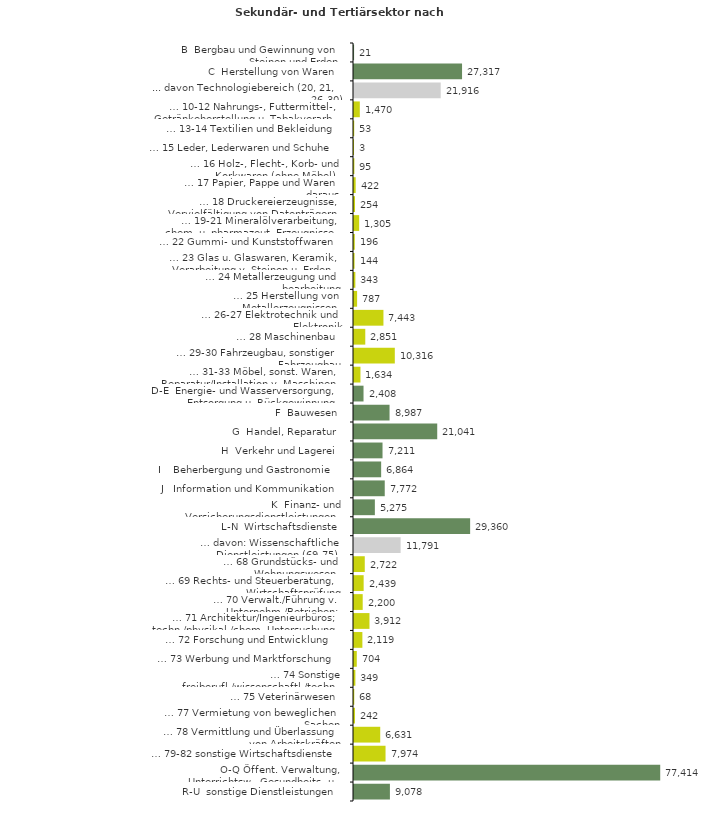
| Category | Series 0 |
|---|---|
| B  Bergbau und Gewinnung von Steinen und Erden | 21 |
| C  Herstellung von Waren | 27317 |
| ... davon Technologiebereich (20, 21, 26-30) | 21916 |
| … 10-12 Nahrungs-, Futtermittel-, Getränkeherstellung u. Tabakverarb. | 1470 |
| … 13-14 Textilien und Bekleidung | 53 |
| … 15 Leder, Lederwaren und Schuhe | 3 |
| … 16 Holz-, Flecht-, Korb- und Korkwaren (ohne Möbel)  | 95 |
| … 17 Papier, Pappe und Waren daraus  | 422 |
| … 18 Druckereierzeugnisse, Vervielfältigung von Datenträgern | 254 |
| … 19-21 Mineralölverarbeitung, chem. u. pharmazeut. Erzeugnisse | 1305 |
| … 22 Gummi- und Kunststoffwaren | 196 |
| … 23 Glas u. Glaswaren, Keramik, Verarbeitung v. Steinen u. Erden  | 144 |
| … 24 Metallerzeugung und -bearbeitung | 343 |
| … 25 Herstellung von Metallerzeugnissen  | 787 |
| … 26-27 Elektrotechnik und Elektronik | 7443 |
| … 28 Maschinenbau | 2851 |
| … 29-30 Fahrzeugbau, sonstiger Fahrzeugbau | 10316 |
| … 31-33 Möbel, sonst. Waren, Reparatur/Installation v. Maschinen | 1634 |
| D-E  Energie- und Wasserversorgung, Entsorgung u. Rückgewinnung | 2408 |
| F  Bauwesen | 8987 |
| G  Handel, Reparatur | 21041 |
| H  Verkehr und Lagerei | 7211 |
| I    Beherbergung und Gastronomie | 6864 |
| J   Information und Kommunikation | 7772 |
| K  Finanz- und Versicherungsdienstleistungen | 5275 |
| L-N  Wirtschaftsdienste | 29360 |
| … davon: Wissenschaftliche Dienstleistungen (69-75) | 11791 |
| … 68 Grundstücks- und Wohnungswesen  | 2722 |
| … 69 Rechts- und Steuerberatung, Wirtschaftsprüfung | 2439 |
| … 70 Verwalt./Führung v. Unternehm./Betrieben; Unternehmensberat. | 2200 |
| … 71 Architektur/Ingenieurbüros; techn./physikal./chem. Untersuchung | 3912 |
| … 72 Forschung und Entwicklung  | 2119 |
| … 73 Werbung und Marktforschung | 704 |
| … 74 Sonstige freiberufl./wissenschaftl./techn. Tätigkeiten | 349 |
| … 75 Veterinärwesen | 68 |
| … 77 Vermietung von beweglichen Sachen  | 242 |
| … 78 Vermittlung und Überlassung von Arbeitskräften | 6631 |
| … 79-82 sonstige Wirtschaftsdienste | 7974 |
| O-Q Öffent. Verwaltung, Unterrichtsw., Gesundheits- u. Sozialwesen | 77414 |
| R-U  sonstige Dienstleistungen | 9078 |